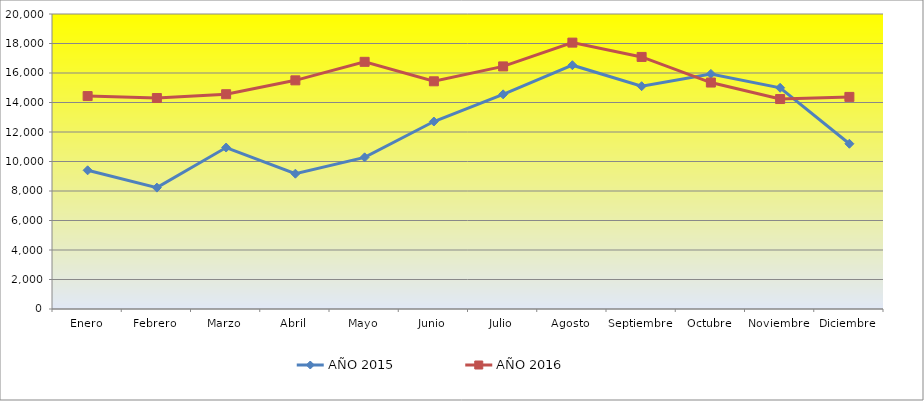
| Category | AÑO 2015 | AÑO 2016 |
|---|---|---|
| Enero | 9403 | 14435 |
| Febrero | 8229 | 14304 |
| Marzo | 10947 | 14561 |
| Abril | 9173 | 15502 |
| Mayo | 10281 | 16758 |
| Junio | 12710 | 15437 |
| Julio | 14552 | 16447 |
| Agosto | 16529 | 18060 |
| Septiembre | 15105 | 17090 |
| Octubre | 15938 | 15353 |
| Noviembre | 14997 | 14235 |
| Diciembre | 11203 | 14380 |